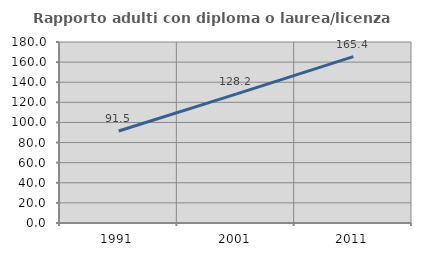
| Category | Rapporto adulti con diploma o laurea/licenza media  |
|---|---|
| 1991.0 | 91.534 |
| 2001.0 | 128.155 |
| 2011.0 | 165.441 |